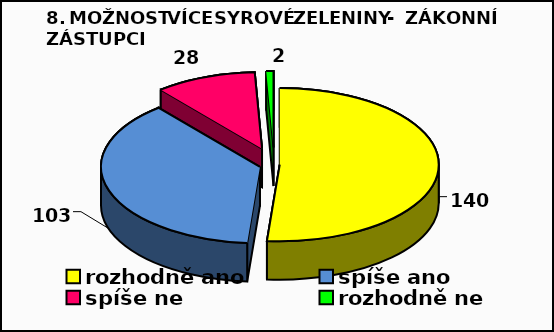
| Category | Series 0 |
|---|---|
| rozhodně ano | 140 |
| spíše ano | 103 |
| spíše ne  | 28 |
| rozhodně ne  | 2 |